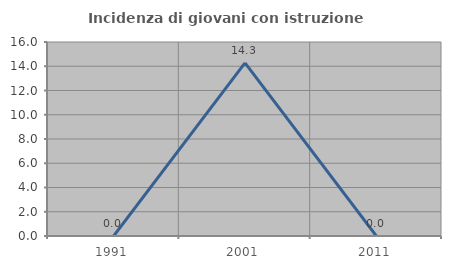
| Category | Incidenza di giovani con istruzione universitaria |
|---|---|
| 1991.0 | 0 |
| 2001.0 | 14.286 |
| 2011.0 | 0 |